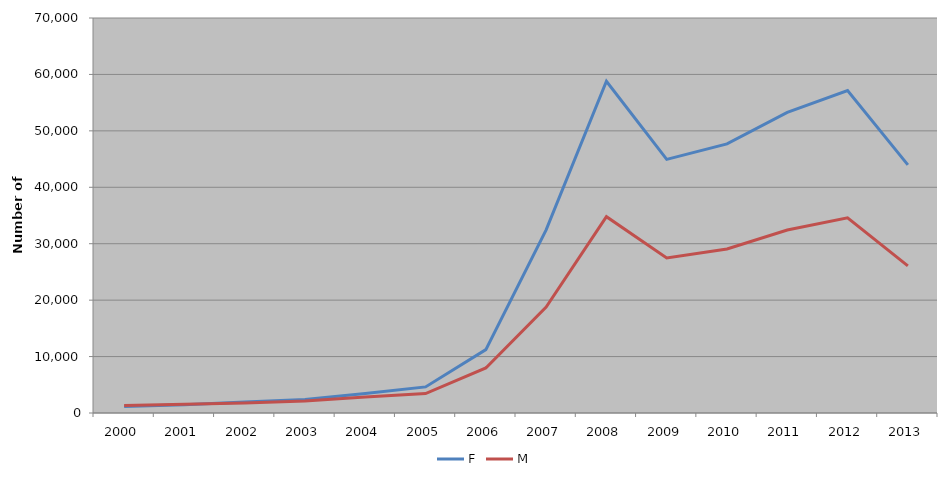
| Category | F | M |
|---|---|---|
| 2000 | 1132 | 1332 |
| 2001 | 1467 | 1548 |
| 2002 | 1937 | 1785 |
| 2003 | 2393 | 2120 |
| 2004 | 3458 | 2842 |
| 2005 | 4624 | 3441 |
| 2006 | 11240 | 7980 |
| 2007 | 32460 | 18781 |
| 2008 | 58795 | 34795 |
| 2009 | 44941 | 27479 |
| 2010 | 47692 | 29056 |
| 2011 | 53272 | 32431 |
| 2012 | 57150 | 34578 |
| 2013 | 43976 | 26081 |